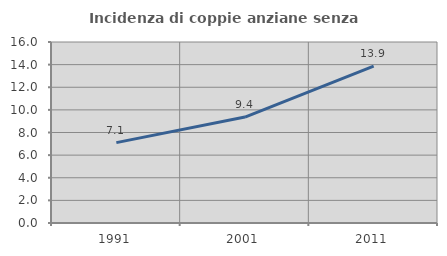
| Category | Incidenza di coppie anziane senza figli  |
|---|---|
| 1991.0 | 7.103 |
| 2001.0 | 9.364 |
| 2011.0 | 13.874 |